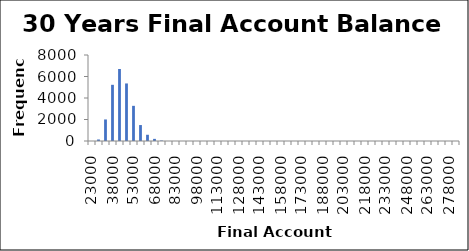
| Category | Frequency |
|---|---|
| 23000.0 | 0 |
| 28000.0 | 141 |
| 33000.0 | 2004 |
| 38000.0 | 5227 |
| 43000.0 | 6698 |
| 48000.0 | 5353 |
| 53000.0 | 3271 |
| 58000.0 | 1483 |
| 63000.0 | 580 |
| 68000.0 | 198 |
| 73000.0 | 43 |
| 78000.0 | 2 |
| 83000.0 | 0 |
| 88000.0 | 0 |
| 93000.0 | 0 |
| 98000.0 | 0 |
| 103000.0 | 0 |
| 108000.0 | 0 |
| 113000.0 | 0 |
| 118000.0 | 0 |
| 123000.0 | 0 |
| 128000.0 | 0 |
| 133000.0 | 0 |
| 138000.0 | 0 |
| 143000.0 | 0 |
| 148000.0 | 0 |
| 153000.0 | 0 |
| 158000.0 | 0 |
| 163000.0 | 0 |
| 168000.0 | 0 |
| 173000.0 | 0 |
| 178000.0 | 0 |
| 183000.0 | 0 |
| 188000.0 | 0 |
| 193000.0 | 0 |
| 198000.0 | 0 |
| 203000.0 | 0 |
| 208000.0 | 0 |
| 213000.0 | 0 |
| 218000.0 | 0 |
| 223000.0 | 0 |
| 228000.0 | 0 |
| 233000.0 | 0 |
| 238000.0 | 0 |
| 243000.0 | 0 |
| 248000.0 | 0 |
| 253000.0 | 0 |
| 258000.0 | 0 |
| 263000.0 | 0 |
| 268000.0 | 0 |
| 273000.0 | 0 |
| 278000.0 | 0 |
| More | 0 |